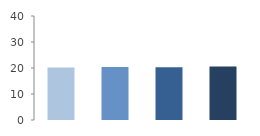
| Category | Rate (%) |
|---|---|
| 2009.0 | 20.209 |
| 2010.0 | 20.405 |
| 2011.0 | 20.329 |
| 2012.0 | 20.61 |